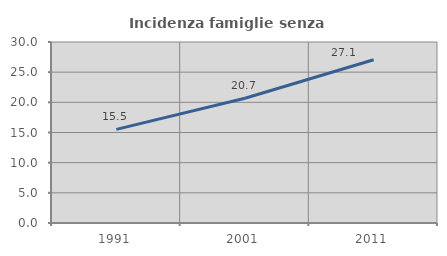
| Category | Incidenza famiglie senza nuclei |
|---|---|
| 1991.0 | 15.512 |
| 2001.0 | 20.668 |
| 2011.0 | 27.066 |